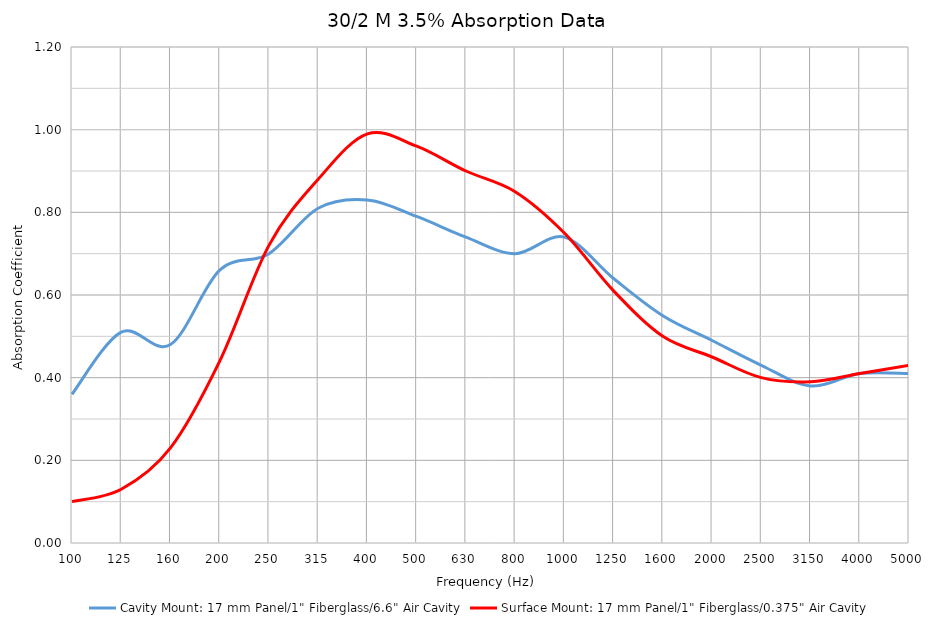
| Category | Cavity Mount: 17 mm Panel/1" Fiberglass/6.6" Air Cavity | Surface Mount: 17 mm Panel/1" Fiberglass/0.375" Air Cavity |
|---|---|---|
| 100.0 | 0.36 | 0.1 |
| 125.0 | 0.51 | 0.13 |
| 160.0 | 0.48 | 0.23 |
| 200.0 | 0.66 | 0.44 |
| 250.0 | 0.7 | 0.72 |
| 315.0 | 0.81 | 0.88 |
| 400.0 | 0.83 | 0.99 |
| 500.0 | 0.79 | 0.96 |
| 630.0 | 0.74 | 0.9 |
| 800.0 | 0.7 | 0.85 |
| 1000.0 | 0.74 | 0.75 |
| 1250.0 | 0.64 | 0.61 |
| 1600.0 | 0.55 | 0.5 |
| 2000.0 | 0.49 | 0.45 |
| 2500.0 | 0.43 | 0.4 |
| 3150.0 | 0.38 | 0.39 |
| 4000.0 | 0.41 | 0.41 |
| 5000.0 | 0.41 | 0.43 |